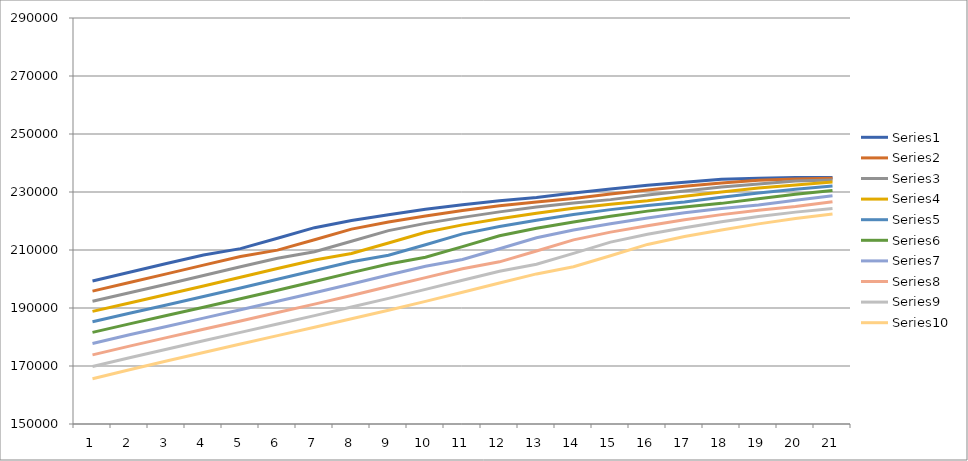
| Category | Series 0 | Series 1 | Series 2 | Series 3 | Series 4 | Series 5 | Series 6 | Series 7 | Series 8 | Series 9 |
|---|---|---|---|---|---|---|---|---|---|---|
| 0 | 199315 | 195827 | 192345 | 188849 | 185270 | 181592 | 177784 | 173848 | 169799 | 165630 |
| 1 | 202324 | 198790 | 195274 | 191745 | 188186 | 184531 | 180761 | 176861 | 172845 | 168724 |
| 2 | 205321 | 201774 | 198206 | 194639 | 191040 | 187397 | 183645 | 179776 | 175789 | 171695 |
| 3 | 208265 | 204780 | 201198 | 197577 | 193941 | 190258 | 186515 | 182664 | 178709 | 174644 |
| 4 | 210471 | 207733 | 204213 | 200578 | 196887 | 193166 | 189383 | 185543 | 181604 | 177570 |
| 5 | 214050 | 209951 | 207176 | 203603 | 199899 | 196121 | 192301 | 188419 | 184493 | 180476 |
| 6 | 217696 | 213538 | 209404 | 206576 | 202933 | 199142 | 195264 | 191346 | 187378 | 183374 |
| 7 | 220161 | 217197 | 213006 | 208819 | 205921 | 202192 | 198302 | 194327 | 190322 | 186278 |
| 8 | 222185 | 219679 | 216681 | 212437 | 208183 | 205199 | 201371 | 197386 | 193325 | 189246 |
| 9 | 224029 | 221724 | 219185 | 216135 | 211825 | 207487 | 204404 | 200484 | 196416 | 192282 |
| 10 | 225633 | 223592 | 221256 | 218667 | 215551 | 211159 | 206728 | 203554 | 199553 | 195415 |
| 11 | 226969 | 225223 | 223152 | 220768 | 218116 | 214918 | 210435 | 205919 | 202665 | 198597 |
| 12 | 228093 | 226585 | 224810 | 222693 | 220250 | 217517 | 214229 | 209663 | 205074 | 201753 |
| 13 | 229634 | 227737 | 226202 | 224383 | 222207 | 219685 | 216865 | 213495 | 208857 | 204207 |
| 14 | 231046 | 229292 | 227371 | 225796 | 223919 | 221668 | 219061 | 216161 | 212721 | 208026 |
| 15 | 232330 | 230719 | 228942 | 226982 | 225353 | 223403 | 221071 | 218386 | 215418 | 211919 |
| 16 | 233365 | 232016 | 230384 | 228569 | 226556 | 224858 | 222828 | 220421 | 217671 | 214645 |
| 17 | 234369 | 233063 | 231693 | 230025 | 228160 | 226080 | 224304 | 222203 | 219731 | 216926 |
| 18 | 234739 | 234077 | 232753 | 231349 | 229632 | 227701 | 225547 | 223701 | 221538 | 219011 |
| 19 | 235038 | 234458 | 233779 | 232423 | 230971 | 229191 | 227188 | 224966 | 223059 | 220843 |
| 20 | 235034 | 234767 | 234171 | 233460 | 232060 | 230546 | 228695 | 226627 | 224347 | 222388 |